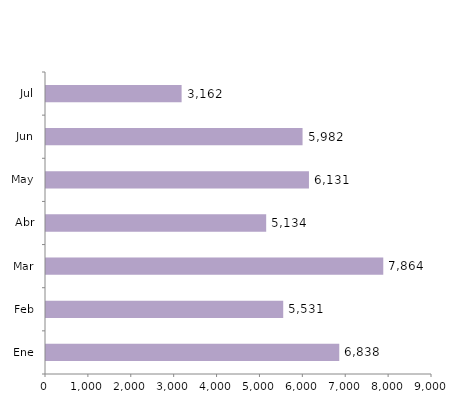
| Category | Series 0 |
|---|---|
| Ene | 6838 |
| Feb | 5531 |
| Mar | 7864 |
| Abr | 5134 |
| May | 6131 |
| Jun | 5982 |
| Jul | 3162 |